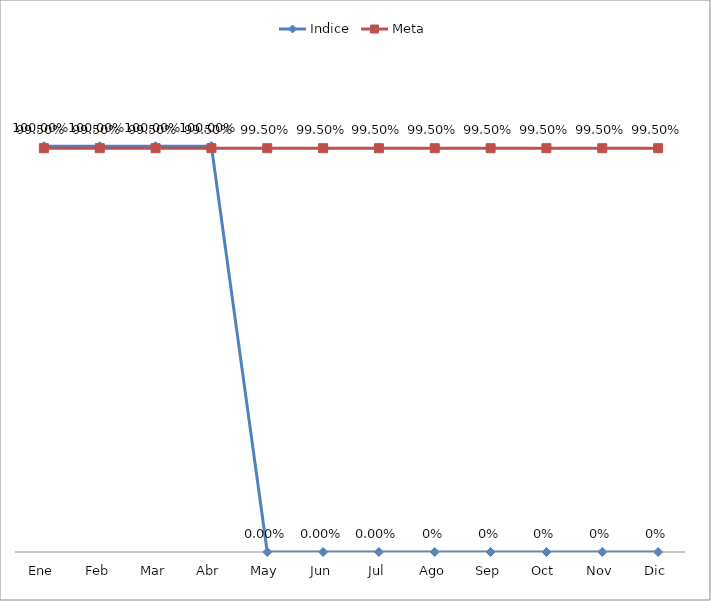
| Category | Indice | Meta |
|---|---|---|
| Ene | 1 | 0.995 |
| Feb | 1 | 0.995 |
| Mar | 1 | 0.995 |
| Abr | 1 | 0.995 |
| May | 0 | 0.995 |
| Jun | 0 | 0.995 |
| Jul | 0 | 0.995 |
| Ago | 0 | 0.995 |
| Sep | 0 | 0.995 |
| Oct | 0 | 0.995 |
| Nov | 0 | 0.995 |
| Dic | 0 | 0.995 |